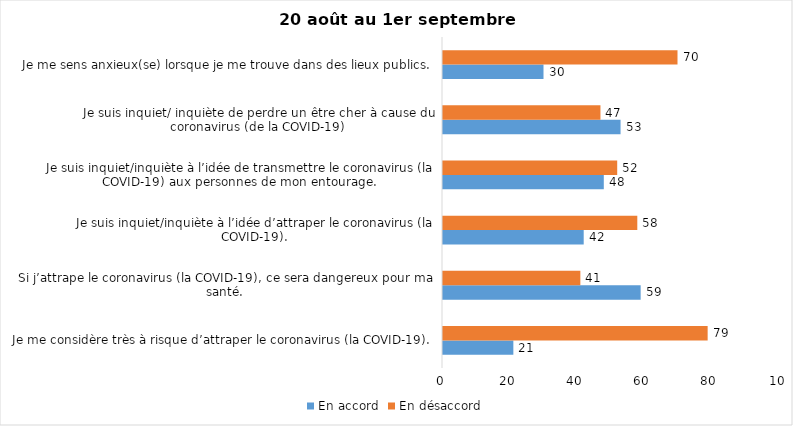
| Category | En accord | En désaccord |
|---|---|---|
| Je me considère très à risque d’attraper le coronavirus (la COVID-19). | 21 | 79 |
| Si j’attrape le coronavirus (la COVID-19), ce sera dangereux pour ma santé. | 59 | 41 |
| Je suis inquiet/inquiète à l’idée d’attraper le coronavirus (la COVID-19). | 42 | 58 |
| Je suis inquiet/inquiète à l’idée de transmettre le coronavirus (la COVID-19) aux personnes de mon entourage. | 48 | 52 |
| Je suis inquiet/ inquiète de perdre un être cher à cause du coronavirus (de la COVID-19) | 53 | 47 |
| Je me sens anxieux(se) lorsque je me trouve dans des lieux publics. | 30 | 70 |